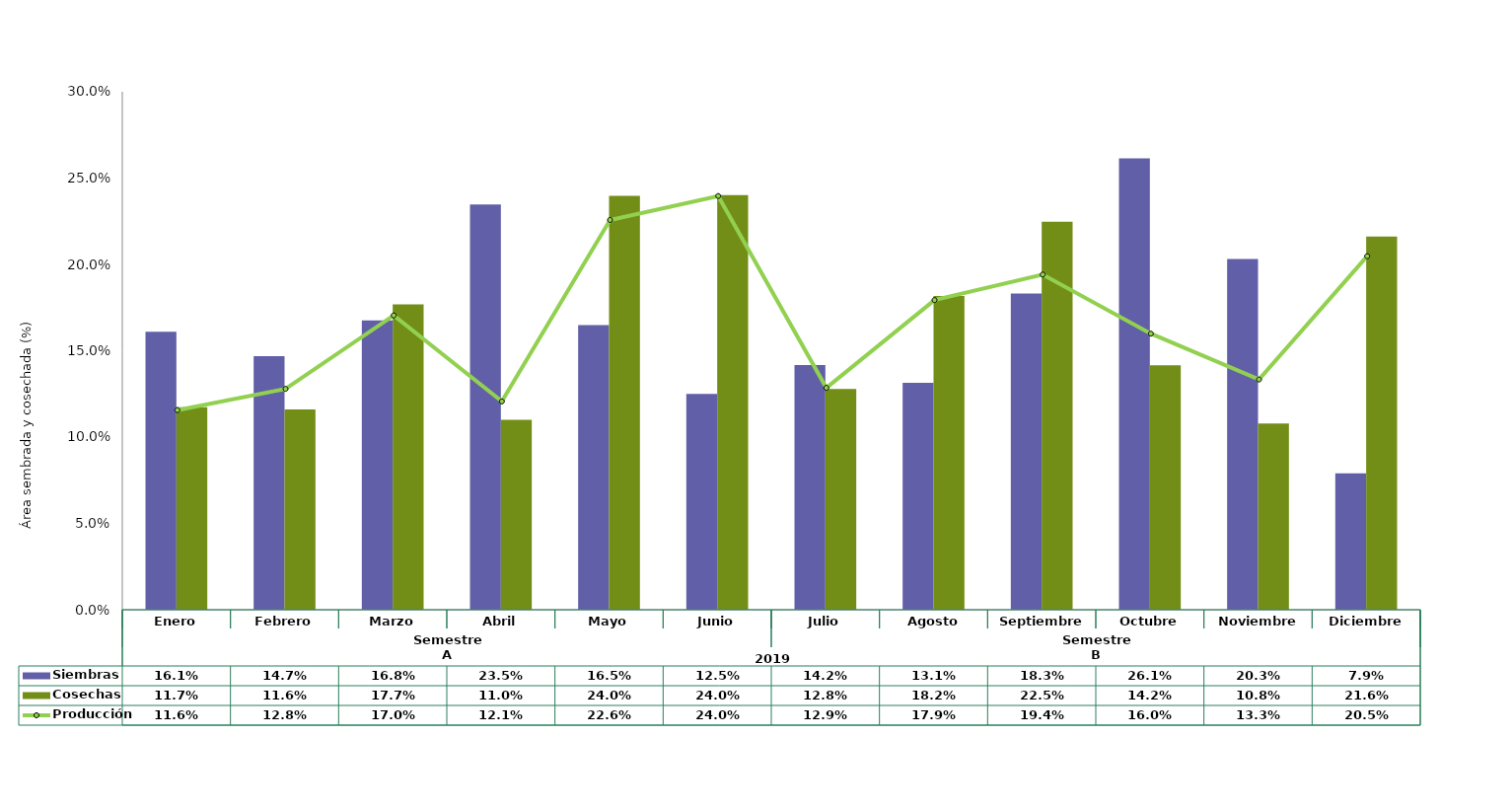
| Category | Siembras | Cosechas   |
|---|---|---|
| 0 | 0.161 | 0.117 |
| 1 | 0.147 | 0.116 |
| 2 | 0.168 | 0.177 |
| 3 | 0.235 | 0.11 |
| 4 | 0.165 | 0.24 |
| 5 | 0.125 | 0.24 |
| 6 | 0.142 | 0.128 |
| 7 | 0.131 | 0.182 |
| 8 | 0.183 | 0.225 |
| 9 | 0.261 | 0.142 |
| 10 | 0.203 | 0.108 |
| 11 | 0.079 | 0.216 |